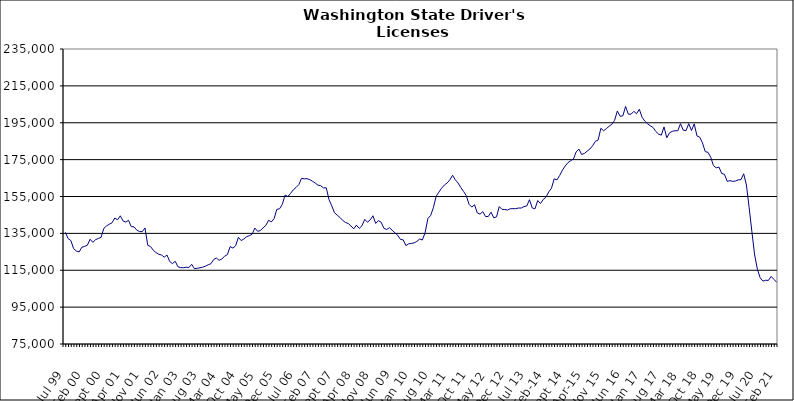
| Category | Series 0 |
|---|---|
| Jul 99 | 135560 |
| Aug 99 | 132182 |
| Sep 99 | 131104 |
| Oct 99 | 126694 |
| Nov 99 | 125425 |
| Dec 99 | 124927 |
| Jan 00 | 127499 |
| Feb 00 | 127927 |
| Mar 00 | 128547 |
| Apr 00 | 131834 |
| May 00 | 130120 |
| Jun 00 | 131595 |
| Jul 00 | 132236 |
| Aug 00 | 132819 |
| Sep 00 | 137711 |
| Oct 00 | 139063 |
| Nov 00 | 139952 |
| Dec 00 | 140732 |
| Jan 01 | 143338 |
| Feb 01 | 142359 |
| Mar 01 | 144523 |
| Apr 01 | 141758 |
| May 01 | 141135 |
| Jun 01 | 142064 |
| Jul 01 | 138646 |
| Aug 01 | 138530 |
| Sep 01 | 136784 |
| Oct 01 | 135996 |
| Nov 01 | 135917 |
| Dec 01 | 137940 |
| Jan 02 | 128531 |
| Feb 02 | 127848 |
| Mar 02 | 125876 |
| Apr 02 | 124595 |
| May 02 | 123660 |
| Jun 02 | 123282 |
| Jul 02 | 122089 |
| Aug 02 | 123279 |
| Sep 02 | 119727 |
| Oct 02 | 118588 |
| Nov 02 | 119854 |
| Dec 02 | 116851 |
| Jan 03 | 116407 |
| Feb 03 | 116382 |
| Mar 03 | 116648 |
| Apr 03 | 116471 |
| May 03 | 118231 |
| Jun 03 | 115831 |
| Jul 03 | 116082 |
| Aug 03 | 116341 |
| Sep 03 | 116653 |
| Oct 03 | 117212 |
| Nov 03 | 117962 |
| Dec 03 | 118542 |
| Jan 04 | 120817 |
| Feb 04 | 121617 |
| Mar 04 | 120369 |
| Apr 04 | 121200 |
| May 04 | 122609 |
| Jun 04 | 123484 |
| Jul 04 | 127844 |
| Aug 04 | 127025 |
| Sep 04 | 128273 |
| Oct 04 | 132853 |
| Nov 04 | 131106 |
| Dec 04 | 131935 |
| Jan 05 | 133205 |
| Feb 05 | 133736 |
| Mar 05 | 134528 |
| Apr 05 | 137889 |
| May 05 | 136130 |
| Jun 05 | 136523 |
| Jul 05 | 137997 |
| Aug 05 | 139294 |
| Sep 05 | 142140 |
| Oct 05 | 141192 |
| Nov 05 | 142937 |
| Dec 05 | 148013 |
| Jan 06 | 148341 |
| Feb 06 | 150744 |
| Mar 06 | 155794 |
| Apr 06 | 154984 |
| May 06 | 156651 |
| Jun 06 | 158638 |
| Jul 06 | 159911 |
| Aug 06 | 161445 |
| Sep 06 | 164852 |
| Oct 06 | 164570 |
| Nov 06 | 164679 |
| Dec 06 | 164127 |
| Jan 07 | 163271 |
| Feb 07 | 162273 |
| Mar 07 | 161140 |
| Apr 07 | 160860 |
| May 07 | 159633 |
| Jun 07 | 159724 |
| Jul 07 | 153303 |
| Aug 07 | 149939 |
| Sep 07 | 146172 |
| Oct 07 | 144876 |
| Nov 07 | 143613 |
| Dec 07 | 142022 |
| Jan 08 | 140909 |
| Feb 08 | 140368 |
| Mar 08 | 138998 |
| Apr 08 | 137471 |
| May 08 | 139453 |
| Jun 08 | 137680 |
| Jul 08 | 139120 |
| Aug 08 | 142612 |
| Sep-08 | 141071 |
| Oct 08 | 142313 |
| Nov 08 | 144556 |
| Dec 08 | 140394 |
| Jan 09 | 141903 |
| Feb 09 | 141036 |
| Mar 09 | 137751 |
| Apr 09 | 137060 |
| May 09 | 138101 |
| Jun 09 | 136739 |
| Jul 09 | 135317 |
| Aug 09 | 134020 |
| Sep 09 | 131756 |
| Oct 09 | 131488 |
| Nov 09 | 128370 |
| Dec 09 | 129323 |
| Jan 10 | 129531 |
| Feb 10 | 129848 |
| Mar 10 | 130654 |
| Apr 10 | 131929 |
| May 10 | 131429 |
| Jun 10 | 135357 |
| Jul 10 | 143032 |
| Aug 10 | 144686 |
| Sep 10 | 148856 |
| Oct 10 | 155042 |
| Nov 10 | 157328 |
| Dec 10 | 159501 |
| Jan 11 | 161221 |
| Feb 11 | 162312 |
| Mar 11 | 163996 |
| Apr 11 | 166495 |
| May 11 | 164040 |
| Jun 11 | 162324 |
| Jul 11 | 159862 |
| Aug 11 | 157738 |
| Sep 11 | 155430 |
| Oct 11 | 150762 |
| Nov 11 | 149255 |
| Dec 11 | 150533 |
| Jan 12 | 146068 |
| Feb 12 | 145446 |
| Mar 12 | 146788 |
| Apr 12 | 144110 |
| May 12 | 144162 |
| Jun 12 | 146482 |
| Jul 12 | 143445 |
| Aug 12 | 143950 |
| Sep 12 | 149520 |
| Oct 12 | 148033 |
| Nov 12 | 147926 |
| Dec 12 | 147674 |
| Jan 13 | 148360 |
| Feb-13 | 148388 |
| Mar-13 | 148414 |
| Apr 13 | 148749 |
| May 13 | 148735 |
| Jun-13 | 149521 |
| Jul 13 | 149837 |
| Aug 13 | 153252 |
| Sep 13 | 148803 |
| Oct 13 | 148315 |
| Nov 13 | 152804 |
| Dec 13 | 151209 |
| Jan 14 | 153357 |
| Feb-14 | 154608 |
| Mar 14 | 157479 |
| Apr 14 | 159441 |
| May 14 | 164591 |
| Jun 14 | 163995 |
| Jul-14 | 166411 |
| Aug-14 | 169272 |
| Sep 14 | 171565 |
| Oct 14 | 173335 |
| Nov 14 | 174406 |
| Dec 14 | 175302 |
| Jan 15 | 179204 |
| Feb 15 | 180737 |
| Mar 15 | 177810 |
| Apr-15 | 178331 |
| May 15 | 179601 |
| Jun-15 | 180729 |
| Jul 15 | 182540 |
| Aug 15 | 184924 |
| Sep 15 | 185620 |
| Oct 15 | 192002 |
| Nov 15 | 190681 |
| Dec 15 | 191795 |
| Jan 16 | 193132 |
| Feb 16 | 194206 |
| Mar 16 | 196319 |
| Apr 16 | 201373 |
| May 16 | 198500 |
| Jun 16 | 198743 |
| Jul 16 | 203841 |
| Aug 16 | 199630 |
| Sep 16 | 199655 |
| Oct 16 | 201181 |
| Nov 16 | 199888 |
| Dec 16 | 202304 |
| Jan 17 | 197977 |
| Feb 17 | 195889 |
| Mar 17 | 194438 |
| Apr 17 | 193335 |
| May 17 | 192430 |
| Jun 17 | 190298 |
| Jul 17 | 188832 |
| Aug 17 | 188264 |
| Sep 17 | 192738 |
| Oct 17 | 186856 |
| Nov 17 | 189537 |
| Dec 17 | 190341 |
| Jan 18 | 190670 |
| Feb 18 | 190645 |
| Mar 18 | 194476 |
| Apr 18 | 190971 |
| May 18 | 190707 |
| Jun 18 | 194516 |
| Jul 18 | 190783 |
| Aug 18 | 194390 |
| Sep 18 | 187831 |
| Oct 18 | 187188 |
| Nov 18 | 184054 |
| Dec 18 | 179347 |
| Jan 19 | 178958 |
| Feb 19 | 176289 |
| Mar 19 | 171747 |
| Apr 19 | 170532 |
| May 19 | 170967 |
| Jun 19 | 167444 |
| Jul 19 | 167059 |
| Aug 19 | 163194 |
| Sep 19 | 163599 |
| Oct 19 | 163212 |
| Nov 19 | 163388 |
| Dec 19 | 164024 |
| Jan 20 | 164114 |
| Feb 20 | 167320 |
| Mar 20 | 161221 |
| Apr 20 | 148866 |
| May 20 | 135821 |
| Jun 20 | 123252 |
| Jul 20 | 115526 |
| Aug 20 | 110940 |
| Sep 20 | 109099 |
| Oct 20 | 109566 |
| Nov 20 | 109488 |
| Dec 20 | 111658 |
| Jan 21 | 110070 |
| Feb 21 | 108491 |